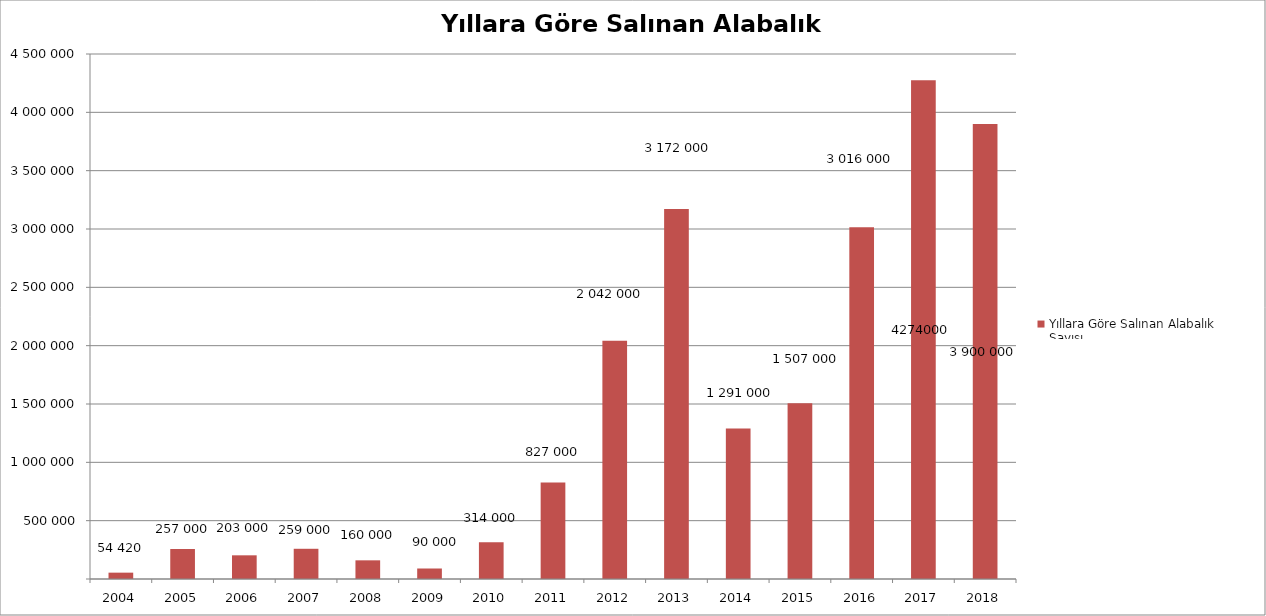
| Category | Yıllara Göre Salınan Alabalık Sayısı |
|---|---|
| 2004.0 | 54420 |
| 2005.0 | 257000 |
| 2006.0 | 203000 |
| 2007.0 | 259000 |
| 2008.0 | 160000 |
| 2009.0 | 90000 |
| 2010.0 | 314000 |
| 2011.0 | 827000 |
| 2012.0 | 2042000 |
| 2013.0 | 3172000 |
| 2014.0 | 1291000 |
| 2015.0 | 1507000 |
| 2016.0 | 3016000 |
| 2017.0 | 4274000 |
| 2018.0 | 3900000 |